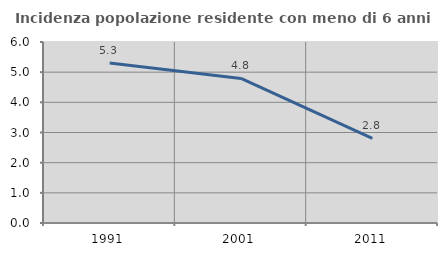
| Category | Incidenza popolazione residente con meno di 6 anni |
|---|---|
| 1991.0 | 5.305 |
| 2001.0 | 4.79 |
| 2011.0 | 2.804 |